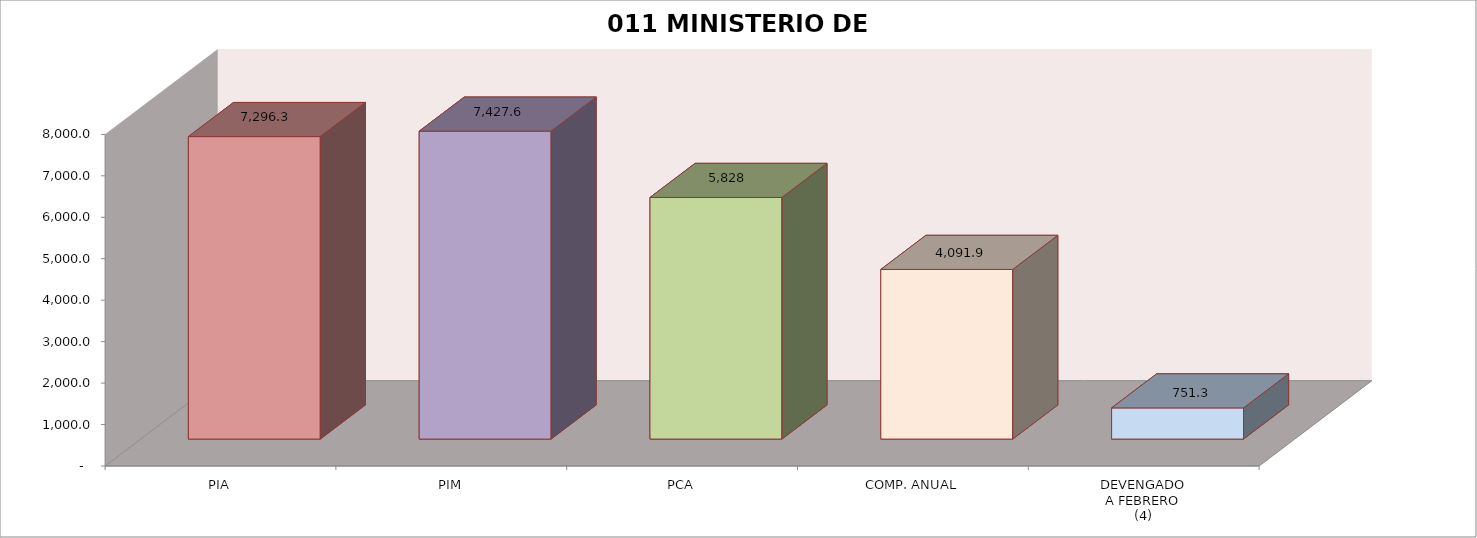
| Category | 011 MINISTERIO DE SALUD |
|---|---|
| PIA | 7296.309 |
| PIM | 7427.558 |
| PCA | 5827.764 |
| COMP. ANUAL | 4091.867 |
| DEVENGADO
A FEBRERO
(4) | 751.292 |